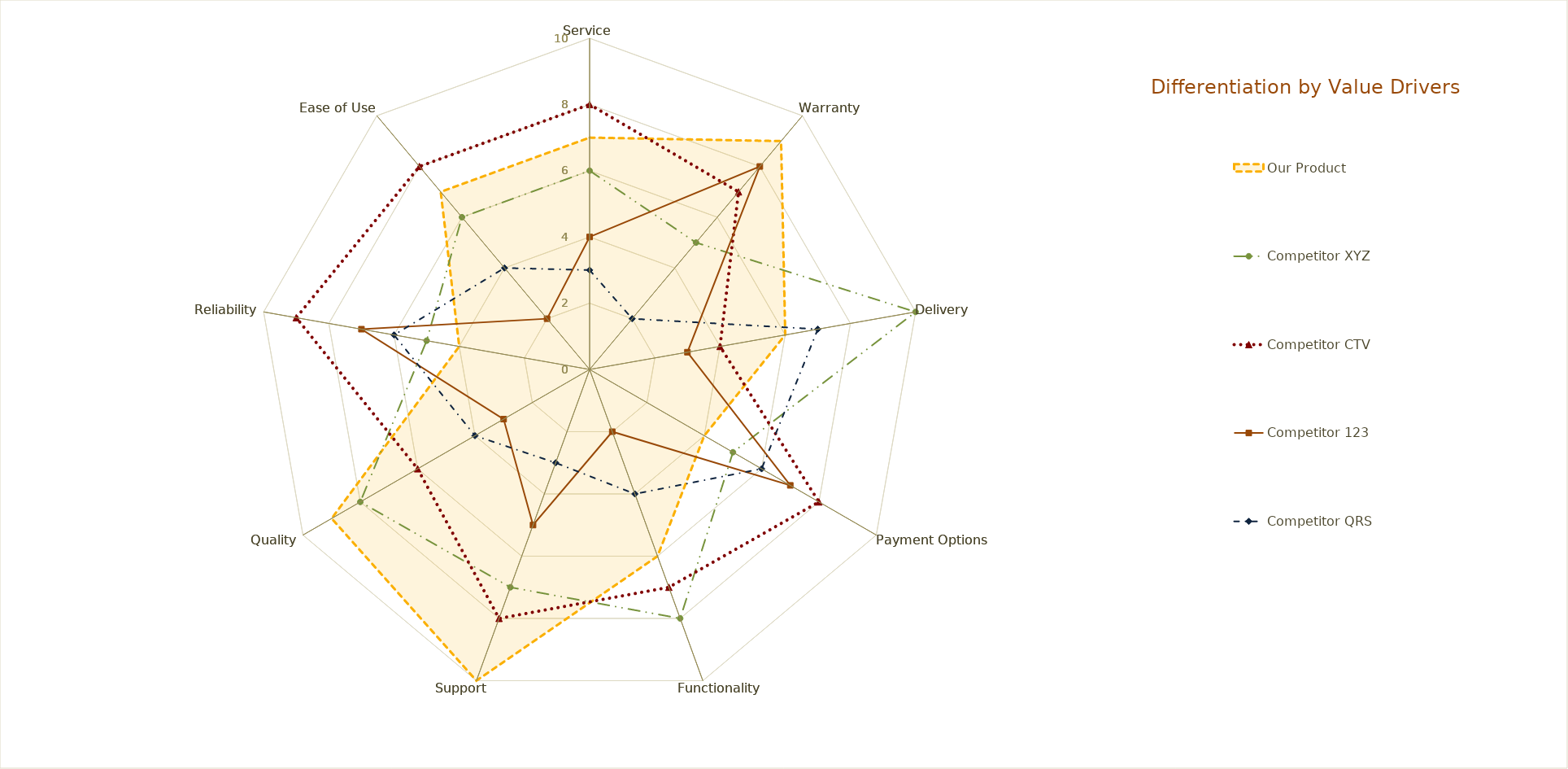
| Category | Our Product |
|---|---|
| Service | 7 |
| Warranty | 9 |
| Delivery | 6 |
| Payment Options | 4 |
| Functionality | 6 |
| Support | 10 |
| Quality | 9 |
| Reliability | 4 |
| Ease of Use | 7 |